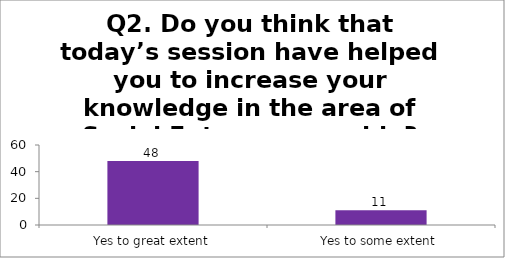
| Category | Q2. Do you think that today’s session have helped you to increase your knowledge in the area of Social Entrepreneurship? |
|---|---|
| Yes to great extent | 48 |
| Yes to some extent | 11 |